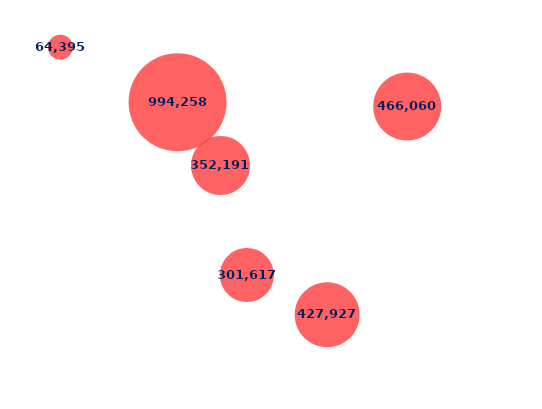
| Category | Series 0 |
|---|---|
| 18.0 | 90 |
| 40.0 | 58 |
| 10.0 | 55 |
| 5.0 | 80 |
| 10.0 | 88 |
| 35.0 | 30 |
| 32.0 | 74 |
| 30.0 | 45 |
| 75.0 | 52 |
| 75.0 | 73 |
| 65.0 | 85 |
| 20.0 | 48 |
| 20.0 | 75 |
| 50.0 | 70 |
| 85.0 | 25 |
| 45.0 | 30 |
| 27.0 | 75 |
| 32.0 | 64 |
| 10.0 | 70 |
| 65.0 | 35 |
| 10.0 | 62 |
| 30.0 | 38 |
| 53.0 | 85 |
| 25.0 | 85 |
| 20.0 | 57 |
| 40.0 | 77 |
| 25.0 | 65 |
| 60.0 | 20 |
| 20.0 | 62 |
| 50.0 | 48 |